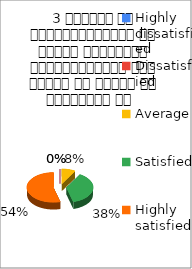
| Category | 3 शिक्षक का विद्यार्थियों के प्रति व्यव्हार मित्रतापूर्ण एवं सहयोग के भावना से परिपूर्ण था   |
|---|---|
| Highly dissatisfied | 0 |
| Dissatisfied | 0 |
| Average | 2 |
| Satisfied | 9 |
| Highly satisfied | 13 |